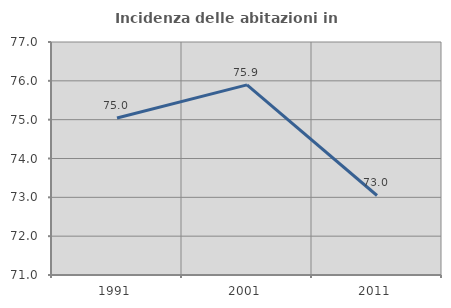
| Category | Incidenza delle abitazioni in proprietà  |
|---|---|
| 1991.0 | 75.042 |
| 2001.0 | 75.896 |
| 2011.0 | 73.047 |